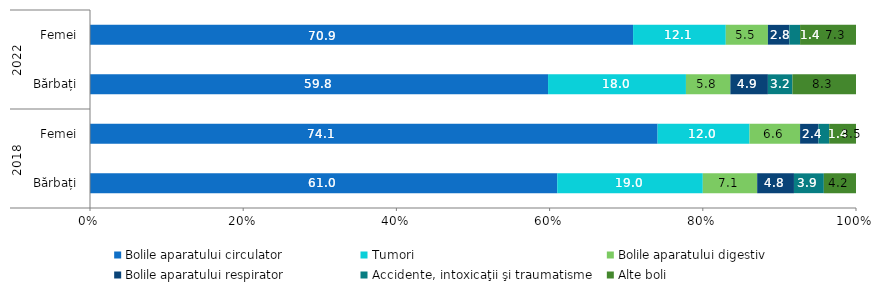
| Category | Bolile aparatului circulator | Tumori | Bolile aparatului digestiv | Bolile aparatului respirator | Accidente, intoxicaţii şi traumatisme | Alte boli |
|---|---|---|---|---|---|---|
| 0 | 61 | 19 | 7.1 | 4.8 | 3.9 | 4.2 |
| 1 | 74.1 | 12 | 6.6 | 2.4 | 1.4 | 3.5 |
| 2 | 59.8 | 18 | 5.8 | 4.9 | 3.2 | 8.3 |
| 3 | 70.9 | 12.1 | 5.5 | 2.8 | 1.4 | 7.3 |